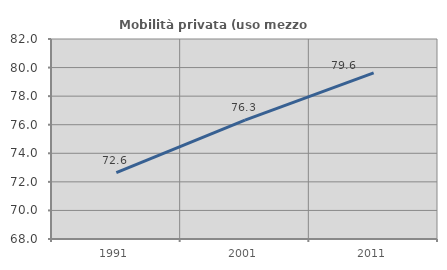
| Category | Mobilità privata (uso mezzo privato) |
|---|---|
| 1991.0 | 72.647 |
| 2001.0 | 76.322 |
| 2011.0 | 79.63 |